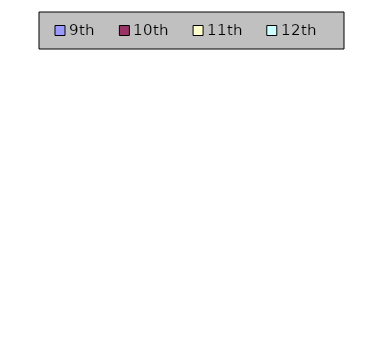
| Category | Series 0 |
|---|---|
| 9th | 0 |
| 10th | 0 |
| 11th | 0 |
| 12th | 0 |